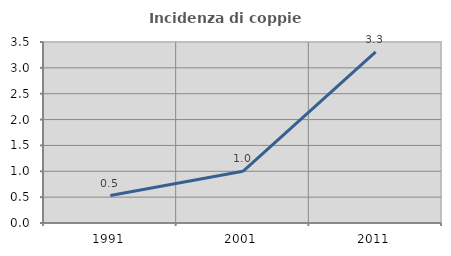
| Category | Incidenza di coppie miste |
|---|---|
| 1991.0 | 0.531 |
| 2001.0 | 0.999 |
| 2011.0 | 3.309 |